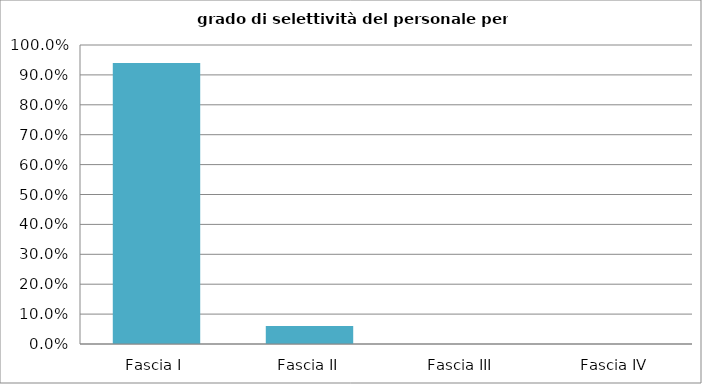
| Category | Totale ente |
|---|---|
| Fascia I | 0.939 |
| Fascia II | 0.061 |
| Fascia III | 0 |
| Fascia IV | 0 |